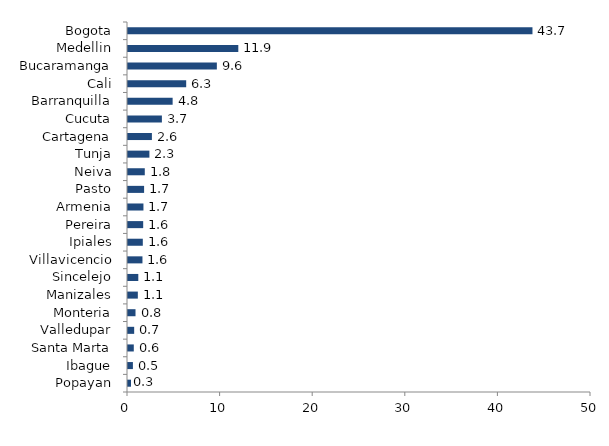
| Category | Series 0 |
|---|---|
| Popayan | 0.327 |
| Ibague | 0.53 |
| Santa Marta | 0.626 |
| Valledupar | 0.667 |
| Monteria | 0.811 |
| Manizales | 1.062 |
| Sincelejo | 1.112 |
| Villavicencio | 1.562 |
| Ipiales | 1.6 |
| Pereira | 1.641 |
| Armenia | 1.668 |
| Pasto | 1.738 |
| Neiva | 1.813 |
| Tunja | 2.312 |
| Cartagena | 2.581 |
| Cucuta | 3.66 |
| Barranquilla | 4.82 |
| Cali | 6.284 |
| Bucaramanga | 9.595 |
| Medellin | 11.912 |
| Bogota | 43.679 |